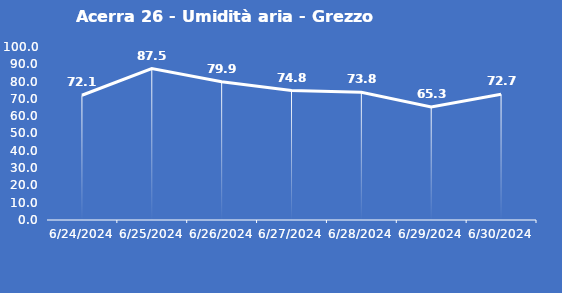
| Category | Acerra 26 - Umidità aria - Grezzo (%) |
|---|---|
| 6/24/24 | 72.1 |
| 6/25/24 | 87.5 |
| 6/26/24 | 79.9 |
| 6/27/24 | 74.8 |
| 6/28/24 | 73.8 |
| 6/29/24 | 65.3 |
| 6/30/24 | 72.7 |